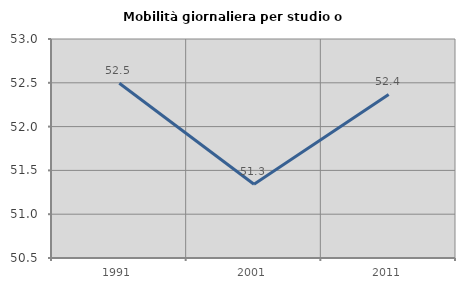
| Category | Mobilità giornaliera per studio o lavoro |
|---|---|
| 1991.0 | 52.494 |
| 2001.0 | 51.341 |
| 2011.0 | 52.367 |